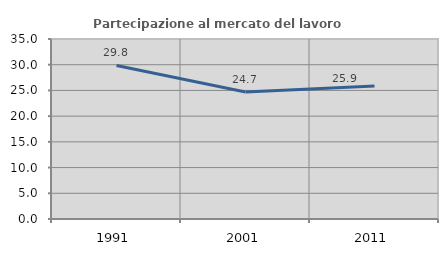
| Category | Partecipazione al mercato del lavoro  femminile |
|---|---|
| 1991.0 | 29.849 |
| 2001.0 | 24.696 |
| 2011.0 | 25.878 |